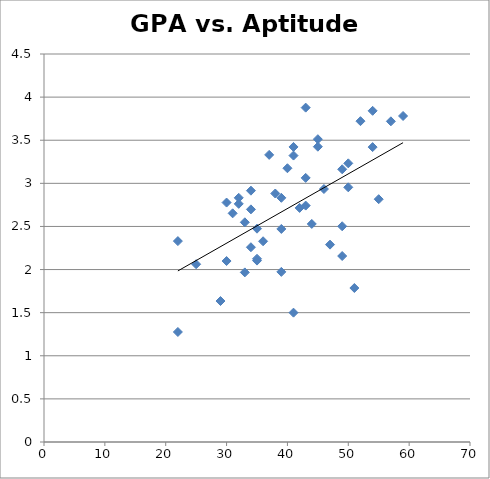
| Category | GPA |
|---|---|
| 59.0 | 3.781 |
| 37.0 | 3.33 |
| 35.0 | 2.474 |
| 40.0 | 3.175 |
| 45.0 | 3.512 |
| 54.0 | 3.841 |
| 34.0 | 2.915 |
| 57.0 | 3.719 |
| 52.0 | 3.721 |
| 31.0 | 2.652 |
| 36.0 | 2.328 |
| 43.0 | 2.742 |
| 49.0 | 2.502 |
| 50.0 | 2.954 |
| 34.0 | 2.259 |
| 25.0 | 2.062 |
| 46.0 | 2.934 |
| 38.0 | 2.882 |
| 34.0 | 2.698 |
| 43.0 | 3.878 |
| 41.0 | 3.422 |
| 43.0 | 3.063 |
| 32.0 | 2.762 |
| 30.0 | 2.099 |
| 39.0 | 2.832 |
| 47.0 | 2.289 |
| 22.0 | 2.33 |
| 50.0 | 3.232 |
| 41.0 | 1.5 |
| 39.0 | 2.471 |
| 30.0 | 2.777 |
| 44.0 | 2.529 |
| 55.0 | 2.816 |
| 49.0 | 3.163 |
| 39.0 | 1.973 |
| 54.0 | 3.42 |
| 41.0 | 3.322 |
| 45.0 | 3.425 |
| 22.0 | 1.276 |
| 29.0 | 1.635 |
| 35.0 | 2.125 |
| 33.0 | 1.967 |
| 33.0 | 2.548 |
| 49.0 | 2.157 |
| 42.0 | 2.715 |
| 35.0 | 2.104 |
| 51.0 | 1.786 |
| 32.0 | 2.832 |